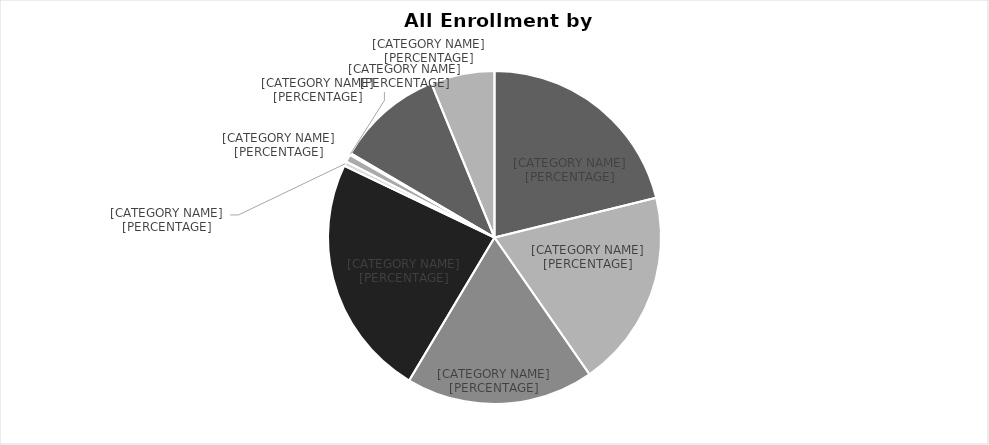
| Category | Series 0 |
|---|---|
| Freshmen | 1501 |
| Sophomores | 1359 |
| Juniors | 1292 |
| Seniors | 1668 |
| Post 
Graduates | 31 |
| Special/
Unclassifieds | 52 |
| Graduate NDS | 13 |
| Masters | 735 |
| Doctors | 439 |